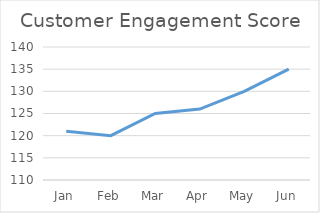
| Category | Customer Engagement Score |
|---|---|
| Jan | 121 |
| Feb | 120 |
| Mar | 125 |
| Apr | 126 |
| May | 130 |
| Jun | 135 |